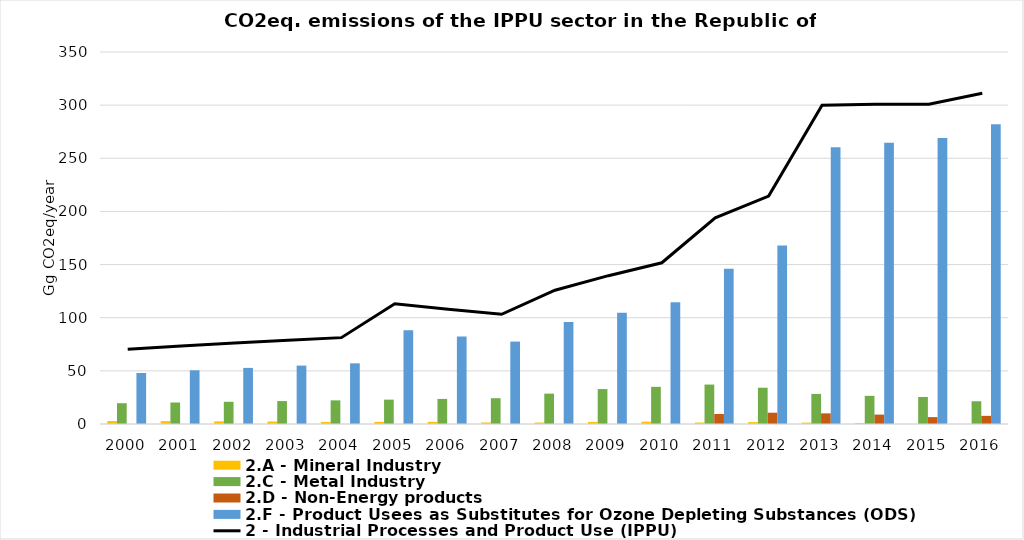
| Category | 2.A - Mineral Industry | 2.C - Metal Industry | 2.D - Non-Energy products | 2.F - Product Usees as Substitutes for Ozone Depleting Substances (ODS) |
|---|---|---|---|---|
| 0 | 2.755 | 19.571 | 0 | 47.993 |
| 1 | 2.698 | 20.224 | 0 | 50.542 |
| 2 | 2.472 | 20.899 | 0 | 52.778 |
| 3 | 2.349 | 21.574 | 0 | 54.962 |
| 4 | 1.917 | 22.249 | 0 | 57.083 |
| 5 | 1.971 | 22.924 | 0 | 88.263 |
| 6 | 2.035 | 23.599 | 0 | 82.402 |
| 7 | 1.44 | 24.275 | 0 | 77.537 |
| 8 | 1.362 | 28.567 | 0 | 95.939 |
| 9 | 1.946 | 32.86 | 0 | 104.754 |
| 10 | 2.156 | 34.98 | 0 | 114.576 |
| 11 | 1.366 | 37.1 | 9.434 | 146.051 |
| 12 | 1.792 | 34.132 | 10.613 | 167.892 |
| 13 | 1.291 | 28.302 | 10.023 | 260.385 |
| 14 | 0.802 | 26.5 | 8.844 | 264.638 |
| 15 | 0 | 25.44 | 6.486 | 269.03 |
| 16 | 0 | 21.412 | 7.665 | 282.104 |